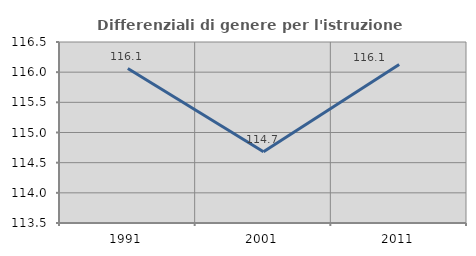
| Category | Differenziali di genere per l'istruzione superiore |
|---|---|
| 1991.0 | 116.06 |
| 2001.0 | 114.68 |
| 2011.0 | 116.128 |